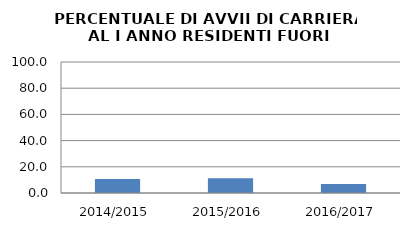
| Category | 2014/2015 2015/2016 2016/2017 |
|---|---|
| 2014/2015 | 10.638 |
| 2015/2016 | 11.29 |
| 2016/2017 | 6.897 |